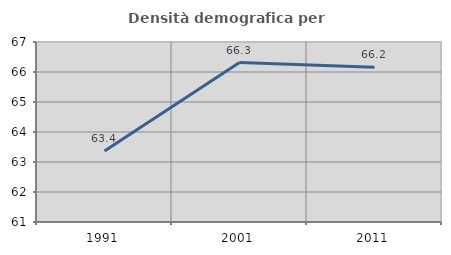
| Category | Densità demografica |
|---|---|
| 1991.0 | 63.367 |
| 2001.0 | 66.313 |
| 2011.0 | 66.162 |